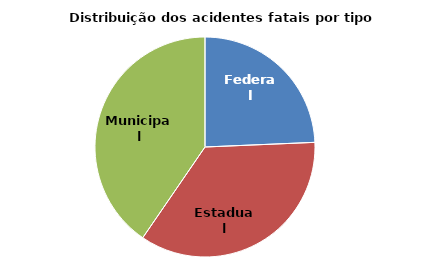
| Category | Series 0 |
|---|---|
| Federal | 450 |
| Estadual | 652 |
| Municipal | 748 |